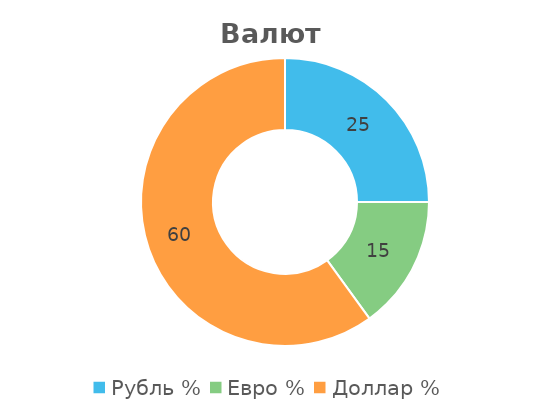
| Category | Series 0 |
|---|---|
| Рубль % | 25 |
| Евро % | 15.019 |
| Доллар % | 59.987 |